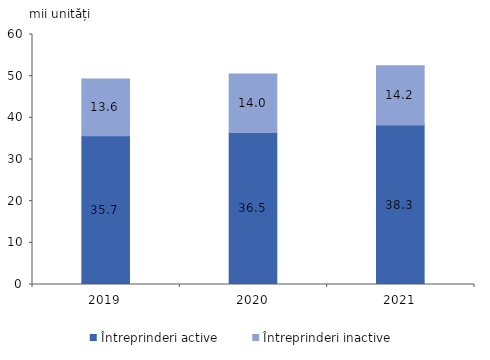
| Category | Întreprinderi active | Întreprinderi inactive |
|---|---|---|
| 2019.0 | 35.7 | 13.6 |
| 2020.0 | 36.5 | 14 |
| 2021.0 | 38.3 | 14.2 |